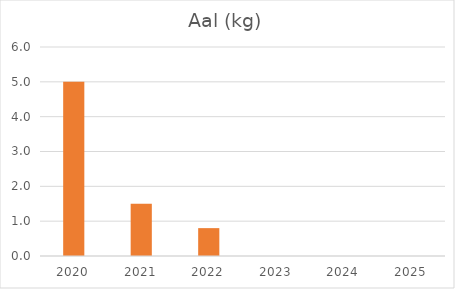
| Category | Aal (kg) |
|---|---|
| 2020.0 | 5 |
| 2021.0 | 1.5 |
| 2022.0 | 0.8 |
| 2023.0 | 0 |
| 2024.0 | 0 |
| 2025.0 | 0 |